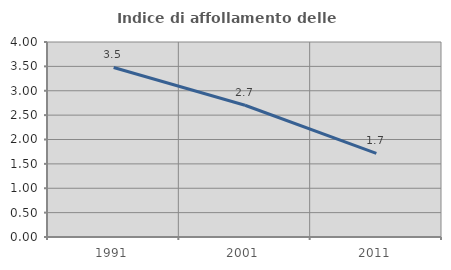
| Category | Indice di affollamento delle abitazioni  |
|---|---|
| 1991.0 | 3.478 |
| 2001.0 | 2.703 |
| 2011.0 | 1.717 |